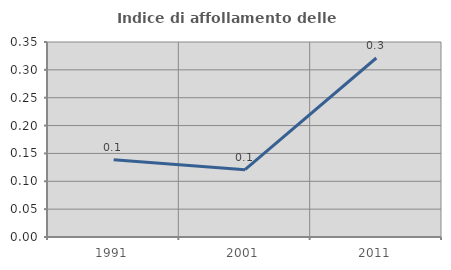
| Category | Indice di affollamento delle abitazioni  |
|---|---|
| 1991.0 | 0.139 |
| 2001.0 | 0.121 |
| 2011.0 | 0.321 |